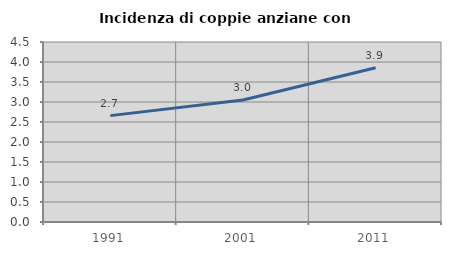
| Category | Incidenza di coppie anziane con figli |
|---|---|
| 1991.0 | 2.66 |
| 2001.0 | 3.048 |
| 2011.0 | 3.857 |